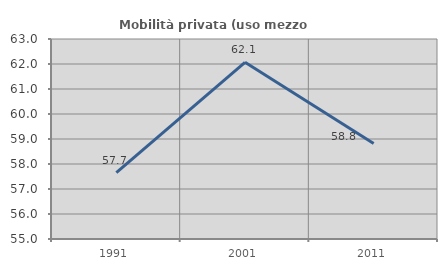
| Category | Mobilità privata (uso mezzo privato) |
|---|---|
| 1991.0 | 57.658 |
| 2001.0 | 62.069 |
| 2011.0 | 58.824 |